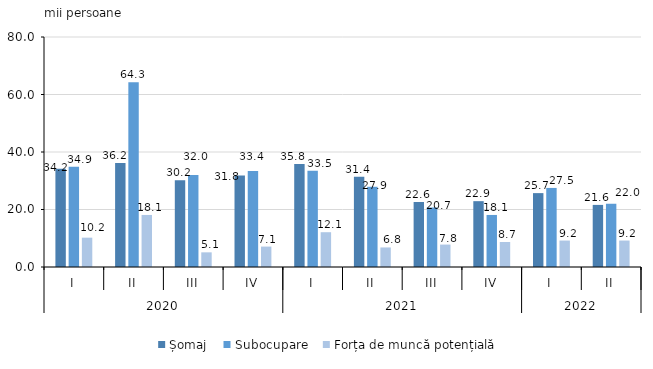
| Category | Șomaj | Subocupare | Forța de muncă potențială |
|---|---|---|---|
| 0 | 34.2 | 34.9 | 10.2 |
| 1 | 36.2 | 64.3 | 18.1 |
| 2 | 30.2 | 32 | 5.1 |
| 3 | 31.8 | 33.4 | 7.1 |
| 4 | 35.8 | 33.5 | 12.1 |
| 5 | 31.4 | 27.9 | 6.8 |
| 6 | 22.6 | 20.7 | 7.8 |
| 7 | 22.9 | 18.1 | 8.7 |
| 8 | 25.7 | 27.5 | 9.2 |
| 9 | 21.6 | 22 | 9.2 |